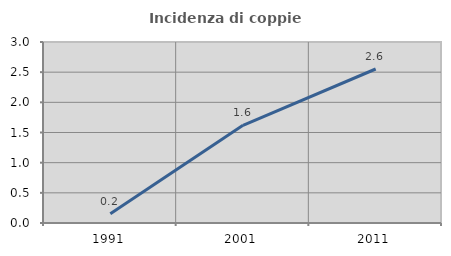
| Category | Incidenza di coppie miste |
|---|---|
| 1991.0 | 0.153 |
| 2001.0 | 1.62 |
| 2011.0 | 2.553 |